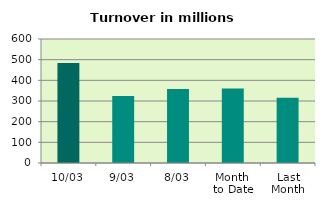
| Category | Series 0 |
|---|---|
| 10/03 | 483.336 |
| 9/03 | 324.415 |
| 8/03 | 358.092 |
| Month 
to Date | 360.94 |
| Last
Month | 316.082 |